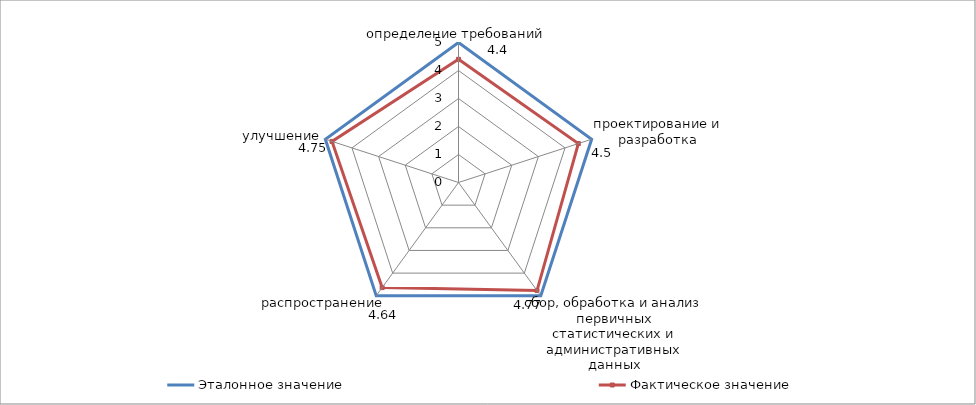
| Category | Эталонное значение | Фактическое значение |
|---|---|---|
| определение требований | 5 | 4.4 |
| проектирование и разработка | 5 | 4.5 |
| сбор, обработка и анализ первичных статистических и административных данных | 5 | 4.77 |
| распространение | 5 | 4.64 |
| улучшение | 5 | 4.75 |